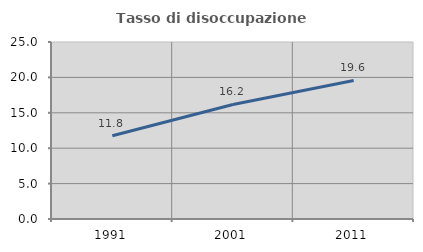
| Category | Tasso di disoccupazione giovanile  |
|---|---|
| 1991.0 | 11.765 |
| 2001.0 | 16.176 |
| 2011.0 | 19.565 |